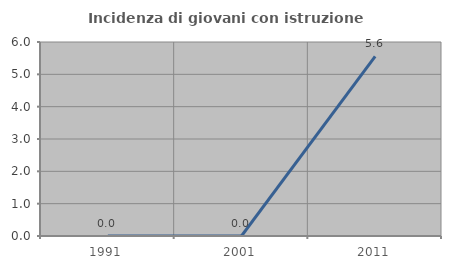
| Category | Incidenza di giovani con istruzione universitaria |
|---|---|
| 1991.0 | 0 |
| 2001.0 | 0 |
| 2011.0 | 5.556 |